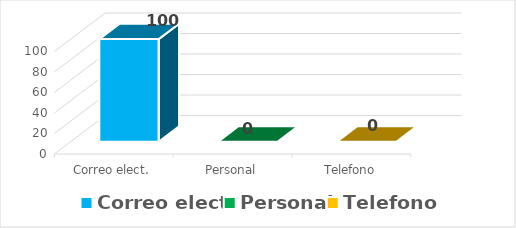
| Category | Series 0 |
|---|---|
| Correo elect. | 100 |
| Personal | 0 |
| Telefono | 0 |